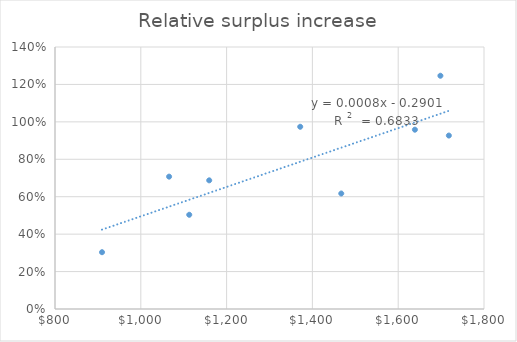
| Category | Relative |
|---|---|
| 1065.9479452054795 | 0.707 |
| 909.6153846153846 | 0.303 |
| 1159.4521739130435 | 0.687 |
| 1718.0596153846154 | 0.927 |
| 1112.9268292682927 | 0.503 |
| 1371.5936893203884 | 0.974 |
| 1638.9417910447762 | 0.958 |
| 1698.3833333333334 | 1.246 |
| 1467.2772727272727 | 0.617 |